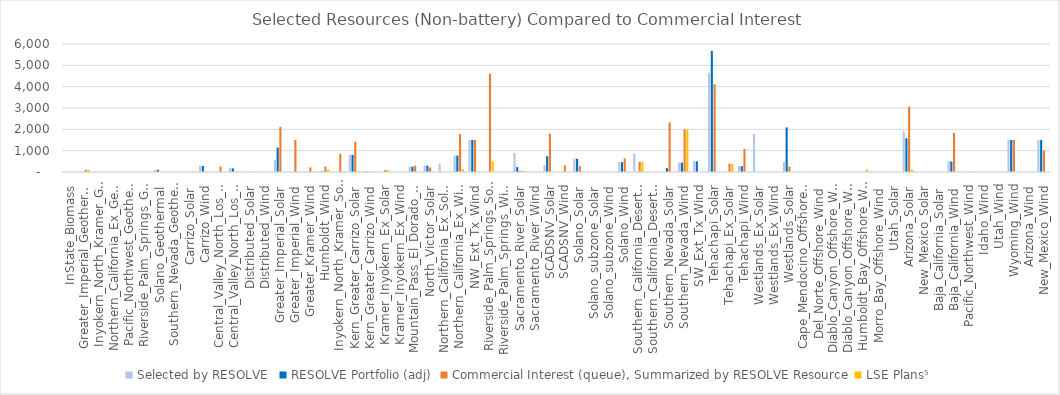
| Category | Selected by RESOLVE  | RESOLVE Portfolio (adj) |  Commercial Interest (queue), Summarized by RESOLVE Resource  | LSE Plans⁵ |
|---|---|---|---|---|
| InState_Biomass | 0 | 0 | 0 | 0 |
| Greater_Imperial_Geothermal | 0 | 0 | 102.28 | 102.28 |
| Inyokern_North_Kramer_Geothermal | 0 | 0 | 0 | 0 |
| Northern_California_Ex_Geothermal | 0 | 0 | 0 | 0 |
| Pacific_Northwest_Geothermal | 0 | 0 | 0 | 0 |
| Riverside_Palm_Springs_Geothermal | 0 | 0 | 0 | 0 |
| Solano_Geothermal | 105 | 105 | 0 | 0 |
| Southern_Nevada_Geothermal | 0 | 0 | 0 | 0 |
| Carrizo_Solar | 0 | 0 | 0 | 0 |
| Carrizo_Wind | 287 | 287 | 0 | 0 |
| Central_Valley_North_Los_Banos_Solar | 0 | 0 | 248.35 | 0 |
| Central_Valley_North_Los_Banos_Wind | 173 | 173 | 0 | 0 |
| Distributed_Solar | 0 | 0 | 0 | 3 |
| Distributed_Wind | 0 | 0 | 0 | 0 |
| Greater_Imperial_Solar | 548 | 1148 | 2106.66 | 0 |
| Greater_Imperial_Wind | 0 | 0 | 1502.3 | 17.538 |
| Greater_Kramer_Wind | 0 | 0 | 212.18 | 0 |
| Humboldt_Wind | 34 | 34 | 259.125 | 116.094 |
| Inyokern_North_Kramer_Solar | 0 | 0 | 852.74 | 23.158 |
| Kern_Greater_Carrizo_Solar | 801.32 | 801.32 | 1420.621 | 25.6 |
| Kern_Greater_Carrizo_Wind | 20 | 20 | 0 | 0 |
| Kramer_Inyokern_Ex_Solar | 0 | 0 | 91 | 91 |
| Kramer_Inyokern_Ex_Wind | 0 | 0 | 0 | 0 |
| Mountain_Pass_El_Dorado_Solar | 248 | 248 | 300 | 0 |
| North_Victor_Solar | 300 | 300 | 210.88 | 0 |
| Northern_California_Ex_Solar | 397 | 0 | 0 | 0 |
| Northern_California_Ex_Wind | 767 | 767 | 1774 | 140 |
| NW_Ext_Tx_Wind | 1500 | 1500 | 1500 | 0 |
| Riverside_Palm_Springs_Solar | 0 | 0 | 4609.61 | 514.485 |
| Riverside_Palm_Springs_Wind | 0 | 0 | 0 | 0 |
| Sacramento_River_Solar | 896 | 231 | 56 | 56 |
| Sacramento_River_Wind | 0 | 0 | 0 | 0 |
| SCADSNV_Solar | 330 | 740 | 1800.104 | 0 |
| SCADSNV_Wind | 0 | 0 | 310 | 0 |
| Solano_Solar | 622 | 622 | 275.9 | 27.18 |
| Solano_subzone_Solar | 0 | 0 | 0 | 0 |
| Solano_subzone_Wind | 0 | 0 | 0 | 0 |
| Solano_Wind | 462 | 462 | 640.904 | 25 |
| Southern_California_Desert_Ex_Solar | 862 | 0 | 475 | 475 |
| Southern_California_Desert_Ex_Wind | 0 | 0 | 0 | 0 |
| Southern_Nevada_Solar | 0 | 182 | 2325 | 0 |
| Southern_Nevada_Wind | 442 | 442 | 2000 | 2000 |
| SW_Ext_Tx_Wind | 500 | 500 | 0 | 0 |
| Tehachapi_Solar | 4656 | 5676 | 4116.798 | 0 |
| Tehachapi_Ex_Solar | 0 | 0 | 388 | 388 |
| Tehachapi_Wind | 275 | 275 | 1086.26 | 0 |
| Westlands_Ex_Solar | 1779 | 0 | 0 | 0 |
| Westlands_Ex_Wind | 0 | 0 | 0 | 0 |
| Westlands_Solar | 468 | 2088 | 248.35 | 0 |
| Cape_Mendocino_Offshore_Wind | 0 | 0 | 0 | 0 |
| Del_Norte_Offshore_Wind | 0 | 0 | 0 | 0 |
| Diablo_Canyon_Offshore_Wind_Ext_Tx | 0 | 0 | 0 | 0 |
| Diablo_Canyon_Offshore_Wind | 0 | 0 | 0 | 0 |
| Humboldt_Bay_Offshore_Wind | 0 | 0 | 0 | 120 |
| Morro_Bay_Offshore_Wind | 0 | 0 | 0 | 0 |
| Utah_Solar | 0 | 0 | 0 | 0 |
| Arizona_Solar | 1910 | 1580 | 3059 | 118.33 |
| New_Mexico_Solar | 0 | 0 | 0 | 0 |
| Baja_California_Solar | 0 | 0 | 0 | 0 |
| Baja_California_Wind | 495 | 495 | 1828 | 0 |
| Pacific_Northwest_Wind | 0 | 0 | 0 | 18 |
| Idaho_Wind | 0 | 0 | 0 | 0 |
| Utah_Wind | 0 | 0 | 0 | 0 |
| Wyoming_Wind | 1500 | 1500 | 1500 | 0 |
| Arizona_Wind | 0 | 0 | 0 | 0 |
| New_Mexico_Wind | 1500 | 1500 | 1000 | 0 |